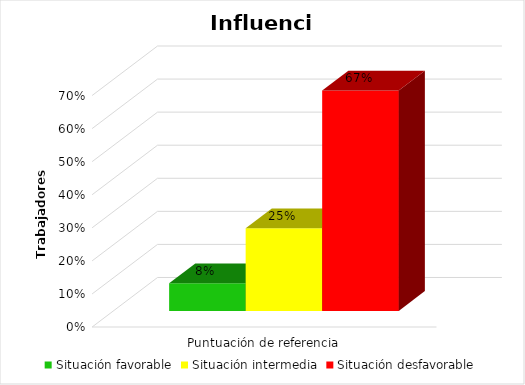
| Category | Situación favorable  | Situación intermedia  | Situación desfavorable |
|---|---|---|---|
| 0 | 0.083 | 0.25 | 0.667 |